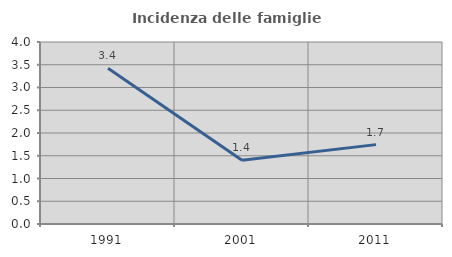
| Category | Incidenza delle famiglie numerose |
|---|---|
| 1991.0 | 3.421 |
| 2001.0 | 1.402 |
| 2011.0 | 1.744 |